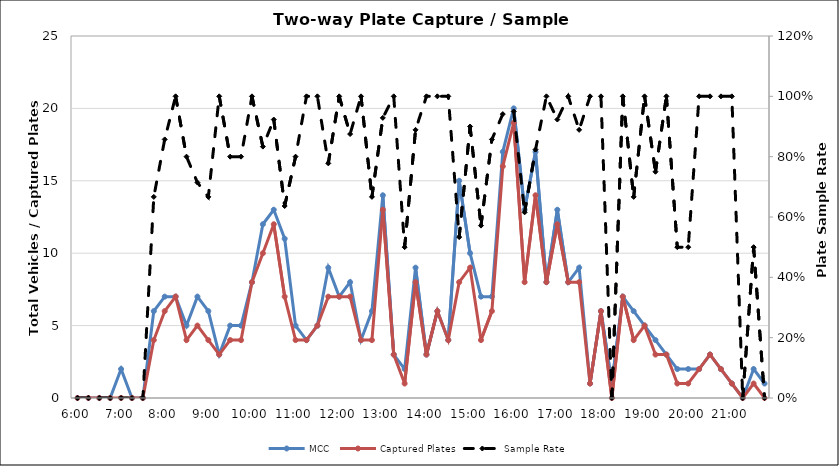
| Category | MCC | Captured Plates |
|---|---|---|
| 0.25 | 0 | 0 |
| 0.260416666666667 | 0 | 0 |
| 0.270833333333333 | 0 | 0 |
| 0.28125 | 0 | 0 |
| 0.291666666666667 | 2 | 0 |
| 0.302083333333333 | 0 | 0 |
| 0.3125 | 0 | 0 |
| 0.322916666666667 | 6 | 4 |
| 0.333333333333333 | 7 | 6 |
| 0.34375 | 7 | 7 |
| 0.354166666666667 | 5 | 4 |
| 0.364583333333333 | 7 | 5 |
| 0.375 | 6 | 4 |
| 0.385416666666667 | 3 | 3 |
| 0.395833333333333 | 5 | 4 |
| 0.40625 | 5 | 4 |
| 0.416666666666667 | 8 | 8 |
| 0.427083333333333 | 12 | 10 |
| 0.4375 | 13 | 12 |
| 0.447916666666667 | 11 | 7 |
| 0.458333333333333 | 5 | 4 |
| 0.46875 | 4 | 4 |
| 0.479166666666667 | 5 | 5 |
| 0.489583333333333 | 9 | 7 |
| 0.5 | 7 | 7 |
| 0.510416666666667 | 8 | 7 |
| 0.520833333333333 | 4 | 4 |
| 0.53125 | 6 | 4 |
| 0.541666666666667 | 14 | 13 |
| 0.552083333333333 | 3 | 3 |
| 0.5625 | 2 | 1 |
| 0.572916666666667 | 9 | 8 |
| 0.583333333333333 | 3 | 3 |
| 0.59375 | 6 | 6 |
| 0.604166666666667 | 4 | 4 |
| 0.614583333333333 | 15 | 8 |
| 0.625 | 10 | 9 |
| 0.635416666666667 | 7 | 4 |
| 0.645833333333333 | 7 | 6 |
| 0.65625 | 17 | 16 |
| 0.666666666666667 | 20 | 19 |
| 0.677083333333333 | 13 | 8 |
| 0.6875 | 17 | 14 |
| 0.697916666666667 | 8 | 8 |
| 0.708333333333333 | 13 | 12 |
| 0.71875 | 8 | 8 |
| 0.729166666666667 | 9 | 8 |
| 0.739583333333333 | 1 | 1 |
| 0.75 | 6 | 6 |
| 0.760416666666667 | 1 | 0 |
| 0.770833333333333 | 7 | 7 |
| 0.78125 | 6 | 4 |
| 0.791666666666667 | 5 | 5 |
| 0.802083333333333 | 4 | 3 |
| 0.8125 | 3 | 3 |
| 0.822916666666667 | 2 | 1 |
| 0.833333333333333 | 2 | 1 |
| 0.84375 | 2 | 2 |
| 0.854166666666667 | 3 | 3 |
| 0.864583333333333 | 2 | 2 |
| 0.875 | 1 | 1 |
| 0.885416666666667 | 0 | 0 |
| 0.895833333333333 | 2 | 1 |
| 0.90625 | 1 | 0 |